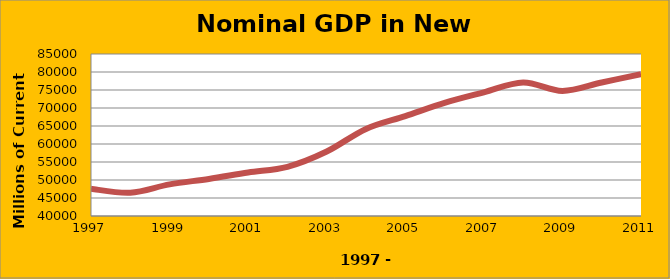
| Category | Nominal GDP in New Mexico |
|---|---|
| 1997.0 | 47552 |
| 1998.0 | 46479 |
| 1999.0 | 48778 |
| 2000.0 | 50294 |
| 2001.0 | 52076 |
| 2002.0 | 53662 |
| 2003.0 | 57906 |
| 2004.0 | 64196 |
| 2005.0 | 67763 |
| 2006.0 | 71426 |
| 2007.0 | 74356 |
| 2008.0 | 77117 |
| 2009.0 | 74736 |
| 2010.0 | 77095 |
| 2011.0 | 79414 |